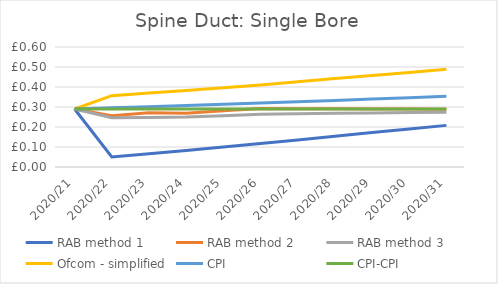
| Category | RAB method 1 | RAB method 2 | RAB method 3 | Ofcom - simplified | CPI | CPI-CPI |
|---|---|---|---|---|---|---|
| 2020/21 | 0.29 | 0.29 | 0.29 | 0.29 | 0.29 | 0.29 |
| 2020/22 | 0.05 | 0.256 | 0.246 | 0.357 | 0.296 | 0.29 |
| 2020/23 | 0.066 | 0.271 | 0.247 | 0.37 | 0.302 | 0.29 |
| 2020/24 | 0.082 | 0.269 | 0.25 | 0.383 | 0.308 | 0.29 |
| 2020/25 | 0.099 | 0.281 | 0.257 | 0.396 | 0.314 | 0.29 |
| 2020/26 | 0.117 | 0.292 | 0.264 | 0.41 | 0.32 | 0.29 |
| 2020/27 | 0.136 | 0.292 | 0.266 | 0.426 | 0.327 | 0.29 |
| 2020/28 | 0.154 | 0.291 | 0.268 | 0.442 | 0.333 | 0.29 |
| 2020/29 | 0.172 | 0.29 | 0.27 | 0.458 | 0.34 | 0.29 |
| 2020/30 | 0.19 | 0.289 | 0.272 | 0.473 | 0.347 | 0.29 |
| 2020/31 | 0.208 | 0.289 | 0.274 | 0.488 | 0.354 | 0.29 |